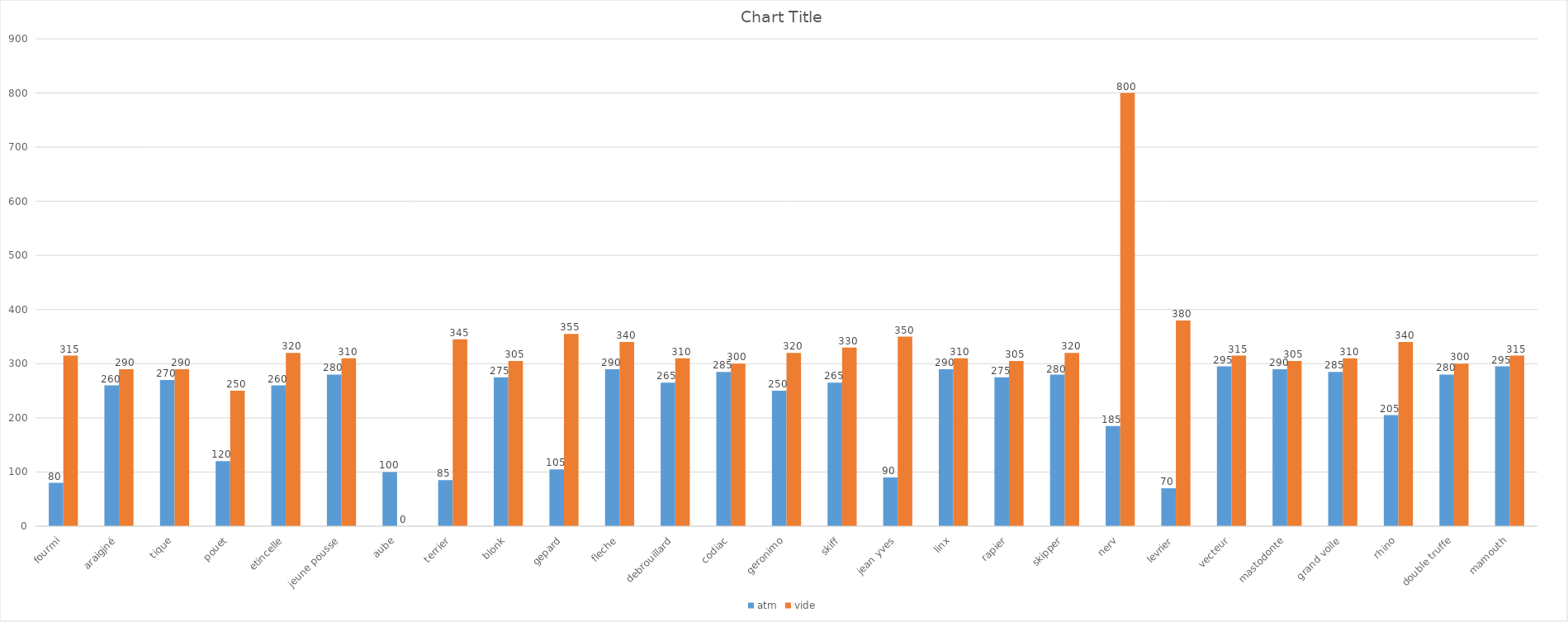
| Category | atm | vide |
|---|---|---|
| fourmi | 80 | 315 |
| araigjné | 260 | 290 |
| tique | 270 | 290 |
| pouet | 120 | 250 |
| etincelle | 260 | 320 |
| jeune pousse | 280 | 310 |
| aube | 100 | 0 |
| terrier | 85 | 345 |
| blonk | 275 | 305 |
| gepard | 105 | 355 |
| fleche | 290 | 340 |
| debrouillard | 265 | 310 |
| codiac | 285 | 300 |
| geronimo | 250 | 320 |
| skiff | 265 | 330 |
| jean yves | 90 | 350 |
| linx | 290 | 310 |
| rapier | 275 | 305 |
| skipper | 280 | 320 |
| nerv | 185 | 800 |
| levrier | 70 | 380 |
| vecteur | 295 | 315 |
| mastodonte | 290 | 305 |
| grand voile | 285 | 310 |
| rhino | 205 | 340 |
| double truffe | 280 | 300 |
| mamouth | 295 | 315 |